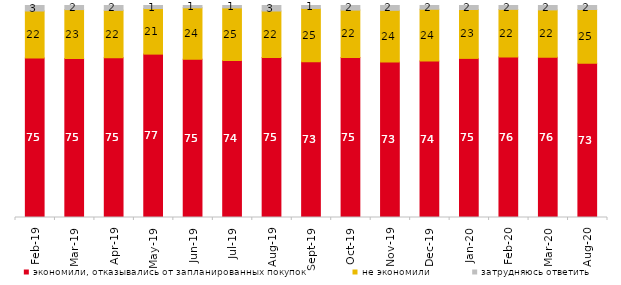
| Category | экономили, отказывались от запланированных покупок | не экономили | затрудняюсь ответить |
|---|---|---|---|
| 2019-02-01 | 75.2 | 22.2 | 2.6 |
| 2019-03-01 | 75.037 | 23.023 | 1.939 |
| 2019-04-01 | 75.297 | 22.426 | 2.277 |
| 2019-05-01 | 77.068 | 21.496 | 1.436 |
| 2019-06-01 | 74.663 | 24.239 | 1.097 |
| 2019-07-01 | 74.109 | 24.752 | 1.139 |
| 2019-08-01 | 75.425 | 21.978 | 2.597 |
| 2019-09-01 | 73.465 | 25.149 | 1.386 |
| 2019-10-01 | 75.495 | 22.327 | 2.178 |
| 2019-11-01 | 73.366 | 24.356 | 2.277 |
| 2019-12-01 | 73.861 | 24.356 | 1.782 |
| 2020-01-01 | 75.05 | 23.069 | 1.881 |
| 2020-02-01 | 75.693 | 22.475 | 1.832 |
| 2020-03-01 | 75.607 | 22.31 | 2.082 |
| 2020-08-01 | 72.79 | 25.323 | 1.887 |